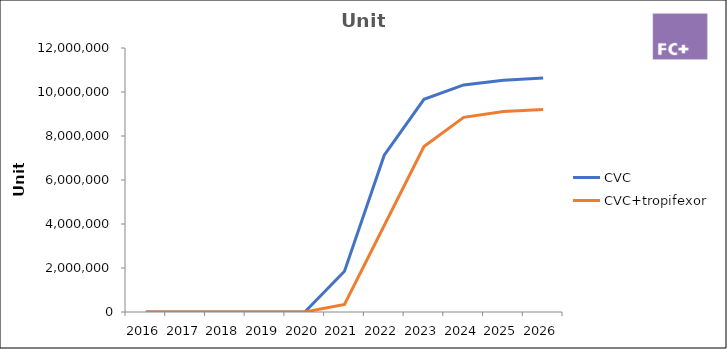
| Category | CVC | CVC+tropifexor |
|---|---|---|
| 2016.0 | 0 | 0 |
| 2017.0 | 0 | 0 |
| 2018.0 | 0 | 0 |
| 2019.0 | 0 | 0 |
| 2020.0 | 0 | 0 |
| 2021.0 | 1855657.584 | 341229.216 |
| 2022.0 | 7125802.43 | 3932916.919 |
| 2023.0 | 9665561.021 | 7524672.316 |
| 2024.0 | 10321579.208 | 8847132.851 |
| 2025.0 | 10530109.512 | 9110537.885 |
| 2026.0 | 10635410.607 | 9201643.263 |